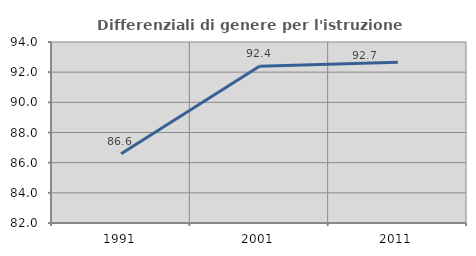
| Category | Differenziali di genere per l'istruzione superiore |
|---|---|
| 1991.0 | 86.585 |
| 2001.0 | 92.393 |
| 2011.0 | 92.658 |